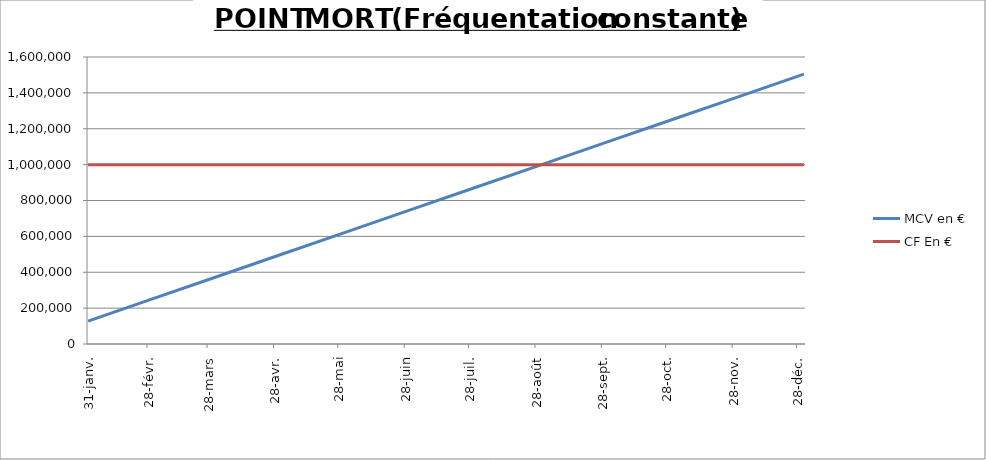
| Category | MCV en € | CF En € |
|---|---|---|
| 2017-01-31 | 127769.6 | 1000000 |
| 2017-02-28 | 243174.4 | 1000000 |
| 2017-03-31 | 370944 | 1000000 |
| 2017-04-30 | 494592 | 1000000 |
| 2017-05-31 | 622361.6 | 1000000 |
| 2017-06-30 | 746009.6 | 1000000 |
| 2017-07-31 | 873779.2 | 1000000 |
| 2017-08-31 | 1001548.8 | 1000000 |
| 2017-09-30 | 1125196.8 | 1000000 |
| 2017-10-31 | 1252966.4 | 1000000 |
| 2017-11-30 | 1376614.4 | 1000000 |
| 2017-12-31 | 1504384 | 1000000 |